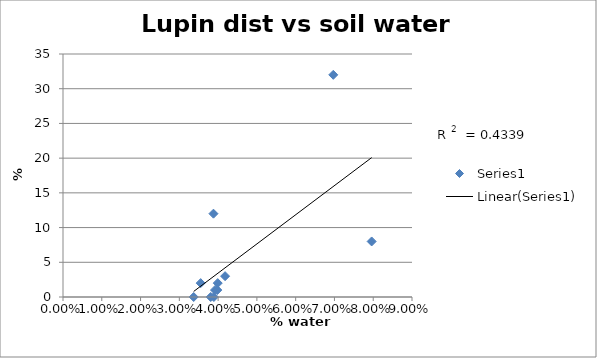
| Category | Series 0 |
|---|---|
| 0.0355 | 2 |
| 0.0392 | 1 |
| 0.0337 | 0 |
| 0.0389 | 0 |
| 0.0381 | 0 |
| 0.0398 | 1 |
| 0.0399 | 2 |
| 0.0418 | 3 |
| 0.0388 | 12 |
| 0.0796 | 8 |
| 0.0697 | 32 |